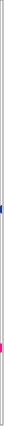
| Category | Nombre de demandes ayant au moins 1 jour sur le mois |
|---|---|
| 2020-03-01 | 1108000 |
| 2020-04-01 | 1240000 |
| 2020-05-01 | 1279000 |
| 2020-06-01 | 1144000 |